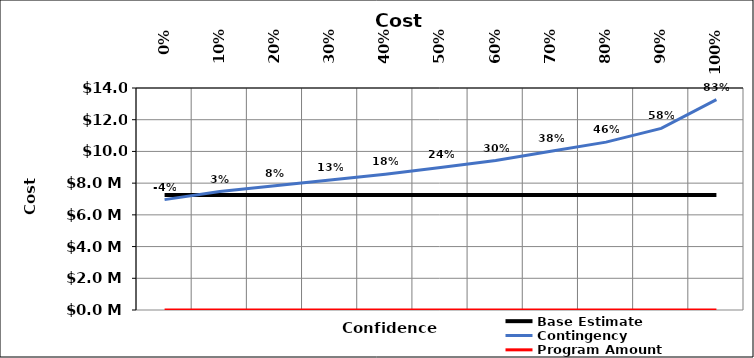
| Category | Base Estimate | Contingency | Program Amount |
|---|---|---|---|
| 0.0 | 7250000 | 6960000 | 0 |
| 0.1 | 7250000 | 7467500 | 0 |
| 0.2 | 7250000 | 7830000 | 0 |
| 0.3 | 7250000 | 8192500 | 0 |
| 0.4 | 7250000 | 8555000 | 0 |
| 0.5 | 7250000 | 8990000 | 0 |
| 0.6 | 7250000 | 9425000 | 0 |
| 0.7 | 7250000 | 10005000 | 0 |
| 0.8 | 7250000 | 10585000 | 0 |
| 0.9 | 7250000 | 11455000 | 0 |
| 1.0 | 7250000 | 13267500 | 0 |